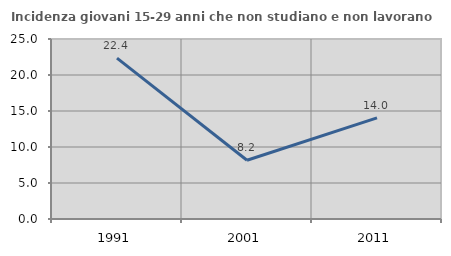
| Category | Incidenza giovani 15-29 anni che non studiano e non lavorano  |
|---|---|
| 1991.0 | 22.353 |
| 2001.0 | 8.166 |
| 2011.0 | 14.049 |